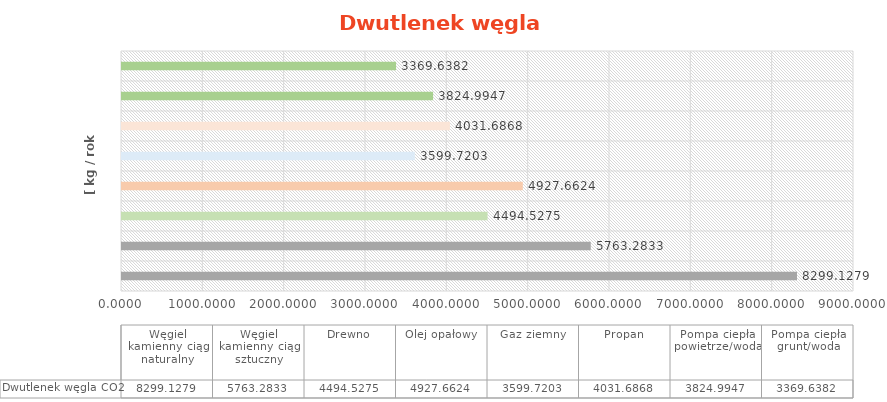
| Category | Dwutlenek węgla |
|---|---|
| Węgiel kamienny ciąg naturalny | 8299.128 |
| Węgiel kamienny ciąg sztuczny | 5763.283 |
| Drewno | 4494.527 |
| Olej opałowy | 4927.662 |
| Gaz ziemny | 3599.72 |
| Propan | 4031.687 |
| Pompa ciepła powietrze/woda | 3824.995 |
| Pompa ciepła grunt/woda | 3369.638 |